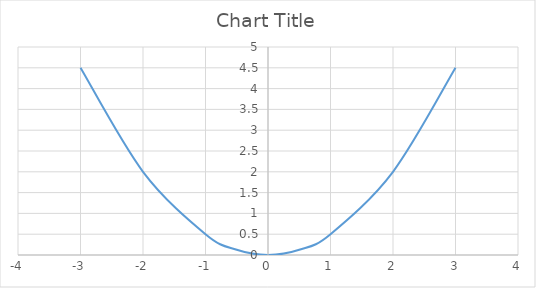
| Category | Series 0 |
|---|---|
| -3.0 | 4.5 |
| -2.0 | 2 |
| -1.0 | 0.5 |
| -0.5 | 0.125 |
| 0.0 | 0 |
| 0.5 | 0.125 |
| 1.0 | 0.5 |
| 2.0 | 2 |
| 3.0 | 4.5 |